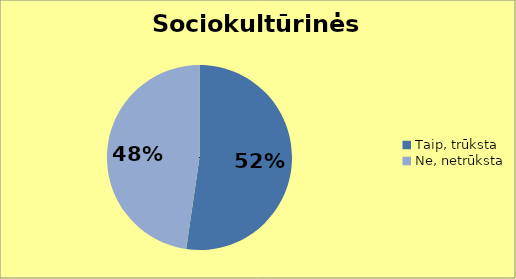
| Category | Series 0 |
|---|---|
| Taip, trūksta | 57 |
| Ne, netrūksta | 52 |